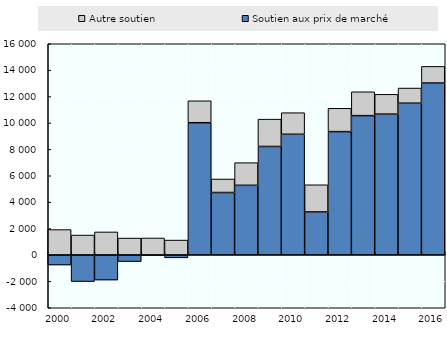
| Category | Soutien aux prix de marché | Autre soutien |
|---|---|---|
| 2000.0 | -760.866 | 1922.397 |
| 2001.0 | -2014.234 | 1507.66 |
| 2002.0 | -1900.921 | 1744.527 |
| 2003.0 | -500.445 | 1279.455 |
| 2004.0 | -43.904 | 1285.838 |
| 2005.0 | -217.406 | 1127.676 |
| 2006.0 | 10017.583 | 1662.905 |
| 2007.0 | 4729.883 | 1022.908 |
| 2008.0 | 5276.485 | 1714.689 |
| 2009.0 | 8217.569 | 2072.112 |
| 2010.0 | 9142.553 | 1635.39 |
| 2011.0 | 3259.14 | 2057.169 |
| 2012.0 | 9342.821 | 1767.757 |
| 2013.0 | 10554.315 | 1808.88 |
| 2014.0 | 10669.709 | 1499.381 |
| 2015.0 | 11496.18 | 1148.537 |
| 2016.0 | 13024.458 | 1260.281 |